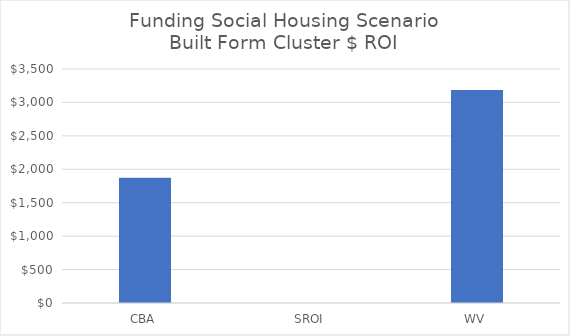
| Category | Built form  |
|---|---|
| CBA | 1872 |
| SROI | 0 |
| WV | 3187.5 |